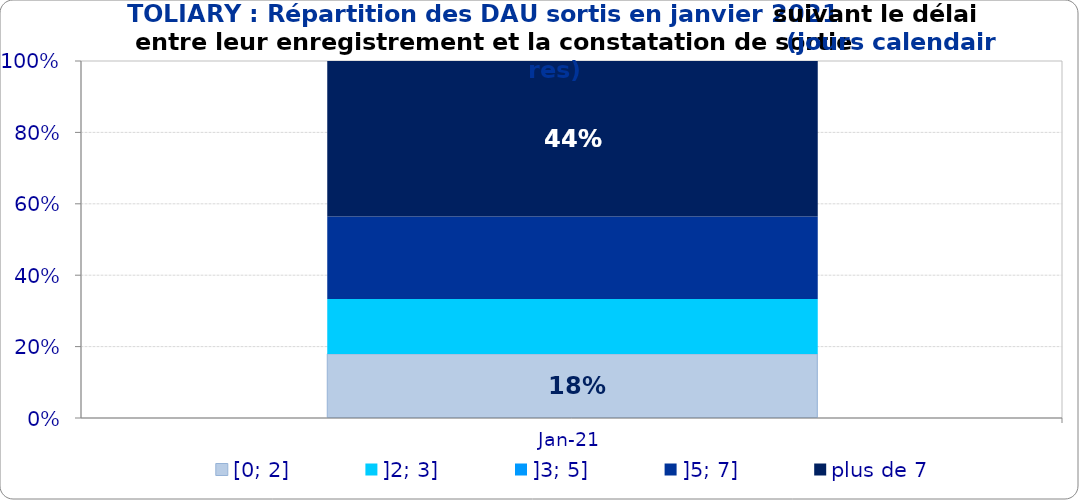
| Category | [0; 2] | ]2; 3] | ]3; 5] | ]5; 7] | plus de 7 |
|---|---|---|---|---|---|
| 2021-01-01 | 0.179 | 0.154 | 0 | 0.231 | 0.436 |